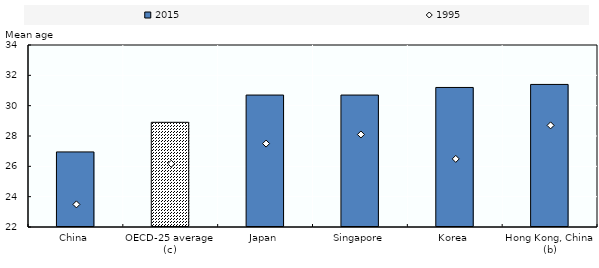
| Category | 2015 |
|---|---|
| China | 26.95 |
| OECD-25 average (c) | 28.903 |
| Japan | 30.7 |
| Singapore | 30.7 |
| Korea | 31.2 |
| Hong Kong, China (b) | 31.4 |